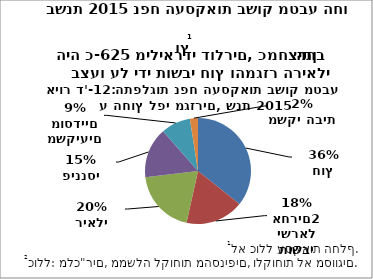
| Category | נפח המסחר שנת 2015 |
|---|---|
| תושבי חוץ | 223245.277 |
| תושבי ישראל אחרים2 | 111016.967 |
| מגזר ריאלי | 122838.574 |
| מגזר פיננסי | 96295.947 |
| משקיעים מוסדיים | 56219.773 |
| משקי הבית | 15323 |